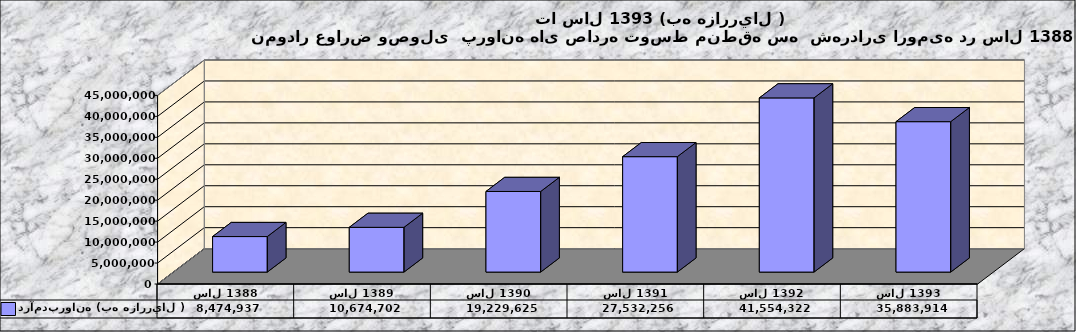
| Category | درآمدپروانه (به هزارريال ) |
|---|---|
| سال 1388 | 8474937 |
| سال 1389 | 10674702 |
| سال 1390 | 19229625 |
| سال 1391 | 27532256 |
| سال 1392 | 41554322 |
| سال 1393 | 35883914 |